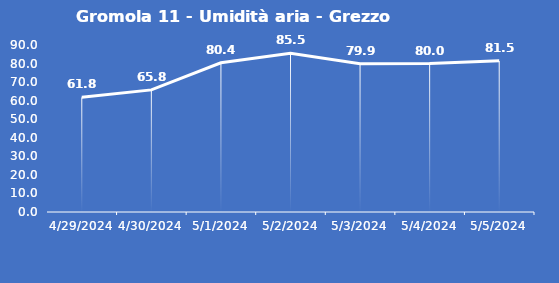
| Category | Gromola 11 - Umidità aria - Grezzo (%) |
|---|---|
| 4/29/24 | 61.8 |
| 4/30/24 | 65.8 |
| 5/1/24 | 80.4 |
| 5/2/24 | 85.5 |
| 5/3/24 | 79.9 |
| 5/4/24 | 80 |
| 5/5/24 | 81.5 |